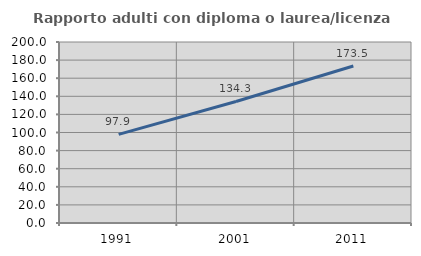
| Category | Rapporto adulti con diploma o laurea/licenza media  |
|---|---|
| 1991.0 | 97.902 |
| 2001.0 | 134.271 |
| 2011.0 | 173.533 |